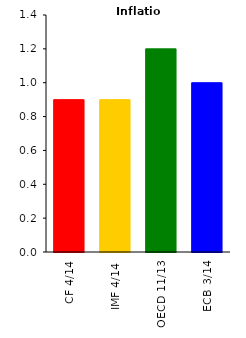
| Category | Inflation |
|---|---|
| CF 4/14 | 0.9 |
| IMF 4/14 | 0.9 |
| OECD 11/13 | 1.2 |
| ECB 3/14 | 1 |